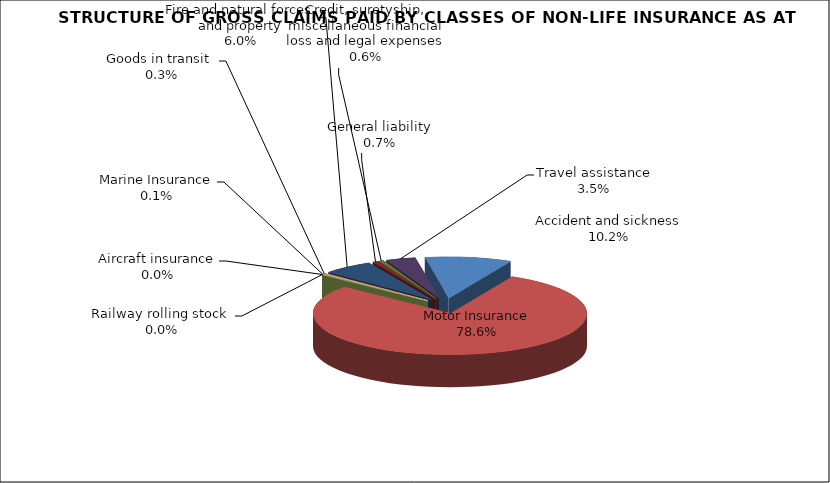
| Category | Accident and sickness |
|---|---|
| Accident and sickness | 0.102 |
| Motor Insurance | 0.786 |
| Railway rolling stock  | 0 |
| Aircraft insurance | 0 |
| Marine Insurance | 0.001 |
| Goods in transit  | 0.003 |
| Fire and natural forces and property | 0.06 |
| General liability | 0.007 |
| Credit, suretyship, miscellaneous financial loss and legal expenses | 0.006 |
| Travel assistance | 0.035 |